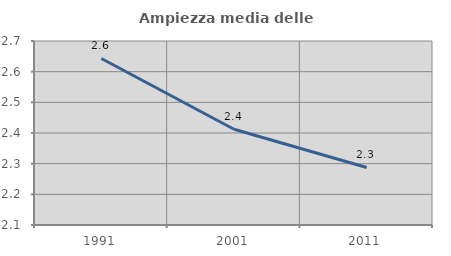
| Category | Ampiezza media delle famiglie |
|---|---|
| 1991.0 | 2.643 |
| 2001.0 | 2.412 |
| 2011.0 | 2.288 |